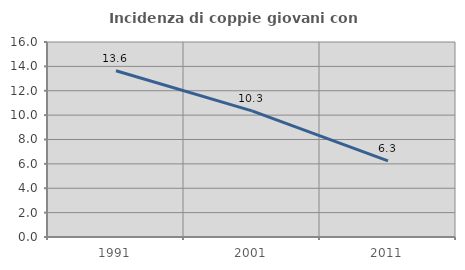
| Category | Incidenza di coppie giovani con figli |
|---|---|
| 1991.0 | 13.636 |
| 2001.0 | 10.345 |
| 2011.0 | 6.25 |